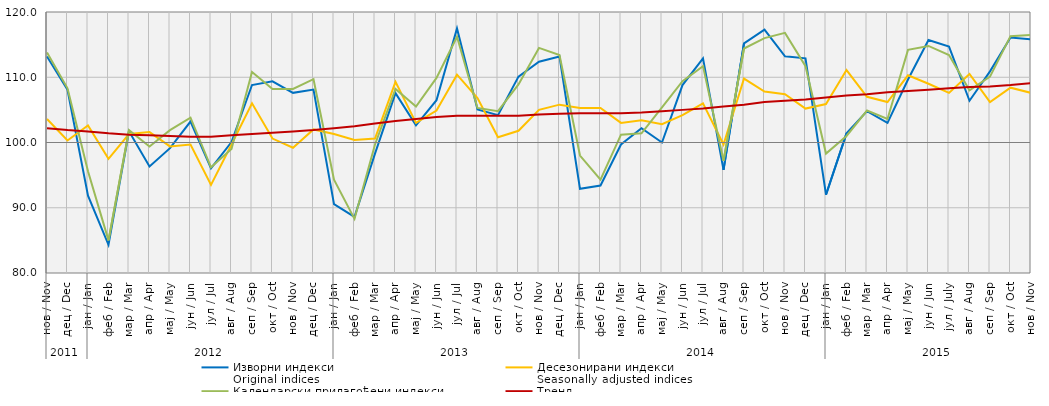
| Category | Изворни индекси
Original indices | Десезонирани индекси
Seasonally adjusted indices | Календарски прилагођени индекси
Working-day adjusted indices | Тренд
Trend |
|---|---|---|---|---|
| 0 | 113.167 | 103.6 | 113.8 | 102.2 |
| 1 | 108.083 | 100.3 | 108.3 | 101.9 |
| 2 | 91.849 | 102.6 | 95.6 | 101.7 |
| 3 | 84.325 | 97.5 | 85 | 101.4 |
| 4 | 101.706 | 101.3 | 101.9 | 101.2 |
| 5 | 96.339 | 101.6 | 99.4 | 101.1 |
| 6 | 99.133 | 99.4 | 101.9 | 101 |
| 7 | 103.214 | 99.7 | 103.8 | 100.9 |
| 8 | 96.046 | 93.5 | 96.2 | 100.9 |
| 9 | 100.071 | 99.7 | 99 | 101.1 |
| 10 | 108.809 | 106 | 110.8 | 101.3 |
| 11 | 109.371 | 100.6 | 108.2 | 101.5 |
| 12 | 107.609 | 99.2 | 108.2 | 101.7 |
| 13 | 108.112 | 102 | 109.7 | 101.9 |
| 14 | 90.559 | 101.3 | 94.3 | 102.2 |
| 15 | 88.596 | 100.4 | 88.3 | 102.5 |
| 16 | 98.288 | 100.6 | 99.7 | 102.9 |
| 17 | 107.567 | 109.3 | 108.2 | 103.3 |
| 18 | 102.635 | 103 | 105.5 | 103.6 |
| 19 | 106.478 | 104.9 | 109.9 | 103.9 |
| 20 | 117.488 | 110.4 | 116.2 | 104.1 |
| 21 | 105.073 | 106.8 | 105.3 | 104.1 |
| 22 | 104.198 | 100.8 | 104.8 | 104.1 |
| 23 | 110.096 | 101.8 | 108.9 | 104.1 |
| 24 | 112.368 | 105 | 114.5 | 104.3 |
| 25 | 113.169 | 105.8 | 113.4 | 104.4 |
| 26 | 92.9 | 105.3 | 98 | 104.5 |
| 27 | 93.4 | 105.3 | 94.3 | 104.5 |
| 28 | 99.7 | 103 | 101.2 | 104.5 |
| 29 | 102.2 | 103.4 | 101.4 | 104.6 |
| 30 | 100 | 102.8 | 105.4 | 104.8 |
| 31 | 108.8 | 104.2 | 109.4 | 105 |
| 32 | 112.9 | 106 | 111.7 | 105.2 |
| 33 | 95.8 | 99.7 | 97.2 | 105.5 |
| 34 | 115.2 | 109.8 | 114.4 | 105.8 |
| 35 | 117.3 | 107.8 | 116 | 106.2 |
| 36 | 113.2 | 107.4 | 116.8 | 106.4 |
| 37 | 112.9 | 105.2 | 111.7 | 106.6 |
| 38 | 92 | 105.9 | 98.3 | 106.9 |
| 39 | 101.4 | 111.1 | 101 | 107.2 |
| 40 | 104.8 | 107 | 104.9 | 107.4 |
| 41 | 103 | 106.2 | 103.6 | 107.7 |
| 42 | 109.651 | 110.3 | 114.2 | 107.9 |
| 43 | 115.698 | 109 | 114.8 | 108.1 |
| 44 | 114.7 | 107.6 | 113.4 | 108.3 |
| 45 | 106.4 | 110.5 | 108 | 108.5 |
| 46 | 110.9 | 106.2 | 110.1 | 108.6 |
| 47 | 116.1 | 108.4 | 116.3 | 108.8 |
| 48 | 115.8 | 107.6 | 116.5 | 109.1 |